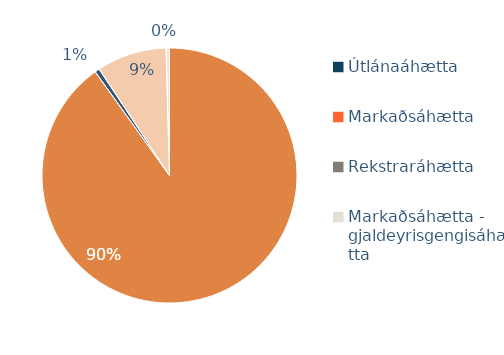
| Category | Series 1 | Series 0 |
|---|---|---|
| Útlánaáhætta | 0.901 | 0.901 |
| Markaðsáhætta | 0.006 | 0.006 |
| Rekstraráhætta | 0.089 | 0.089 |
| Markaðsáhætta - gjaldeyrisgengisáhætta | 0.004 | 0.004 |